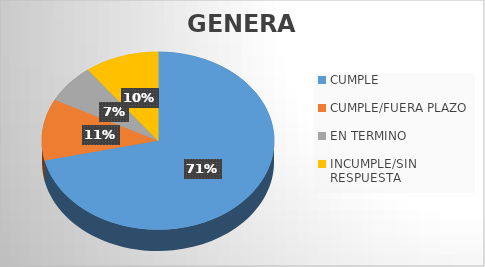
| Category | Series 0 | Series 1 |
|---|---|---|
| CUMPLE | 885 | 0.714 |
| CUMPLE/FUERA PLAZO | 138 | 0.111 |
| EN TERMINO | 88 | 0.071 |
| INCUMPLE/SIN RESPUESTA | 128 | 0.103 |